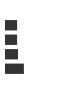
| Category | Series 0 |
|---|---|
| 0 | 0.156 |
| 1 | 0.156 |
| 2 | 0.169 |
| 3 | 0.252 |